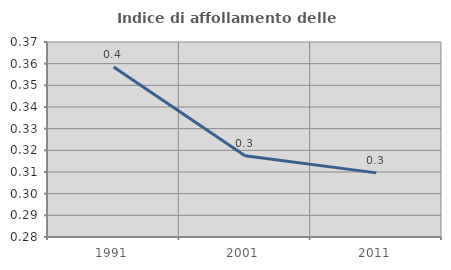
| Category | Indice di affollamento delle abitazioni  |
|---|---|
| 1991.0 | 0.358 |
| 2001.0 | 0.317 |
| 2011.0 | 0.31 |